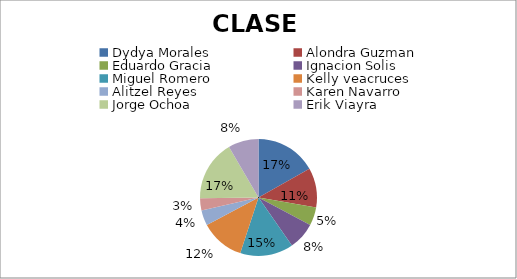
| Category | CLASE  | casa  | PORTAFOLIO | EXAMEN | PROMEDIO  |
|---|---|---|---|---|---|
| Dydya Morales | 40 | 18 | 10 | 27 | 23.75 |
| Alondra Guzman  | 26 | 16 | 5 | 15 | 15.5 |
| Eduardo Gracia  | 12 | 15 | 8 | 9 | 11 |
| Ignacion Solis  | 18 | 8 | 9 | 12 | 11.75 |
| Miguel Romero  | 35 | 6 | 4 | 18 | 15.75 |
| Kelly veacruces  | 29 | 4 | 10 | 30 | 18.25 |
| Alitzel Reyes  | 10 | 2 | 4 | 24 | 10 |
| Karen Navarro  | 8 | 10 | 6 | 10 | 8.5 |
| Jorge Ochoa  | 40 | 20 | 10 | 30 | 25 |
| Erik Viayra  | 20 | 10 | 5 | 15 | 12.5 |